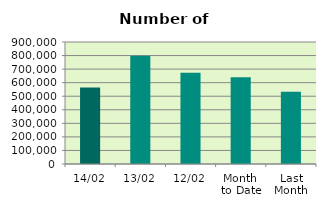
| Category | Series 0 |
|---|---|
| 14/02 | 564962 |
| 13/02 | 798834 |
| 12/02 | 673290 |
| Month 
to Date | 640388.2 |
| Last
Month | 532699.545 |